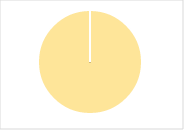
| Category | Total |
|---|---|
| Y | 0 |
| R | 0 |
| T | 0 |
| M | 0 |
| F | 0 |
| N | 12 |